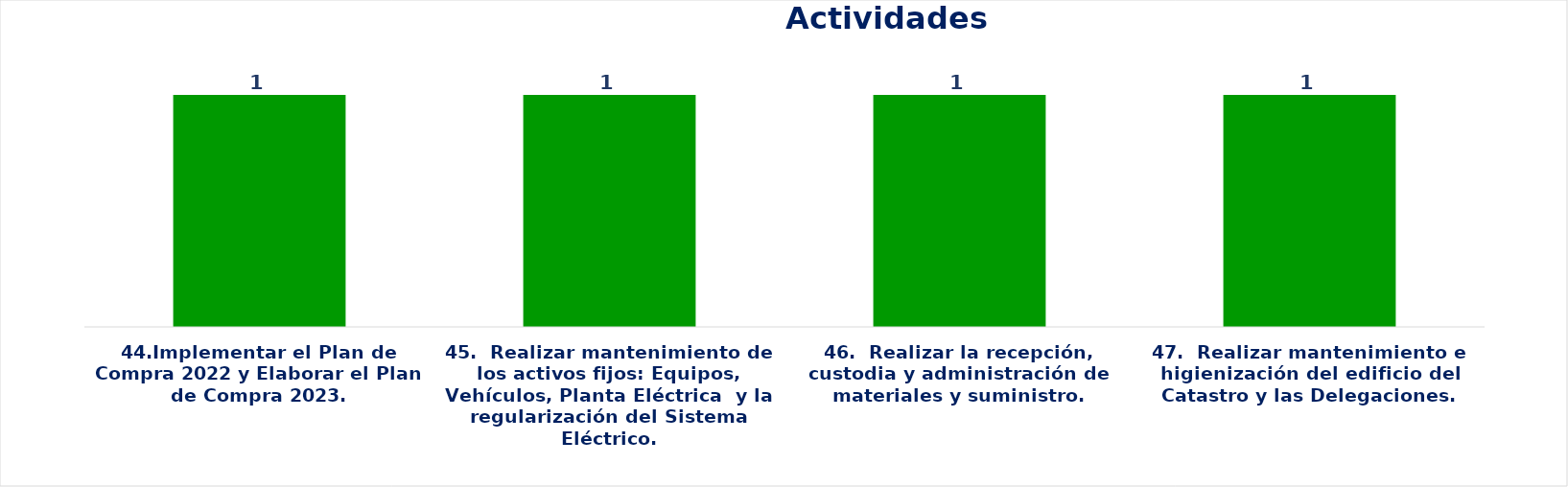
| Category | Series 0 |
|---|---|
| 44.Implementar el Plan de Compra 2022 y Elaborar el Plan de Compra 2023. | 1 |
| 45.  Realizar mantenimiento de los activos fijos: Equipos, Vehículos, Planta Eléctrica  y la regularización del Sistema Eléctrico. | 1 |
| 46.  Realizar la recepción, custodia y administración de materiales y suministro. | 1 |
| 47.  Realizar mantenimiento e higienización del edificio del Catastro y las Delegaciones. | 1 |